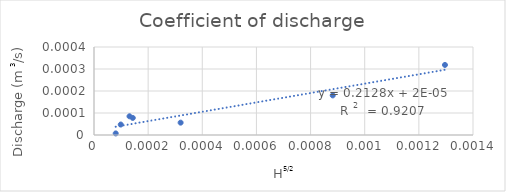
| Category | QA (m3/s) |
|---|---|
| 0.00014321713933744106 | 0 |
| 0.0012964181424216497 | 0 |
| 0.0008818163074019444 | 0 |
| 0.00013118829216054312 | 0 |
| 9.882117688026188e-05 | 0 |
| 8.02268221980653e-05 | 0 |
| 0.0003200000000000001 | 0 |